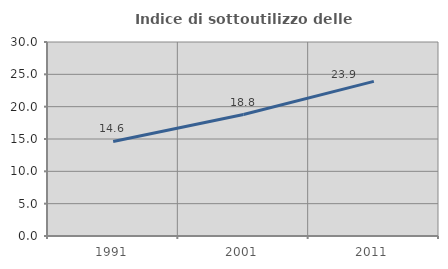
| Category | Indice di sottoutilizzo delle abitazioni  |
|---|---|
| 1991.0 | 14.618 |
| 2001.0 | 18.783 |
| 2011.0 | 23.917 |